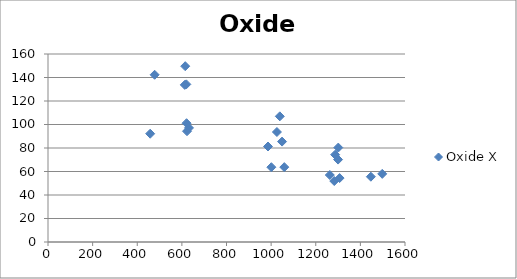
| Category | Oxide X |
|---|---|
| 1059.0 | 63.717 |
| 1049.0 | 85.445 |
| 1039.0 | 106.945 |
| 1026.0 | 93.613 |
| 1001.0 | 63.649 |
| 986.0 | 81.263 |
| 1447.0 | 55.567 |
| 458.0 | 92.158 |
| 1263.0 | 56.995 |
| 1283.0 | 51.887 |
| 1301.0 | 80.358 |
| 1287.0 | 74.308 |
| 1300.0 | 70.144 |
| 1307.0 | 54.406 |
| 632.0 | 97.1 |
| 621.0 | 101.104 |
| 623.0 | 94.277 |
| 620.0 | 134.174 |
| 613.0 | 133.72 |
| 615.0 | 149.627 |
| 478.0 | 142.321 |
| 1498.0 | 57.991 |